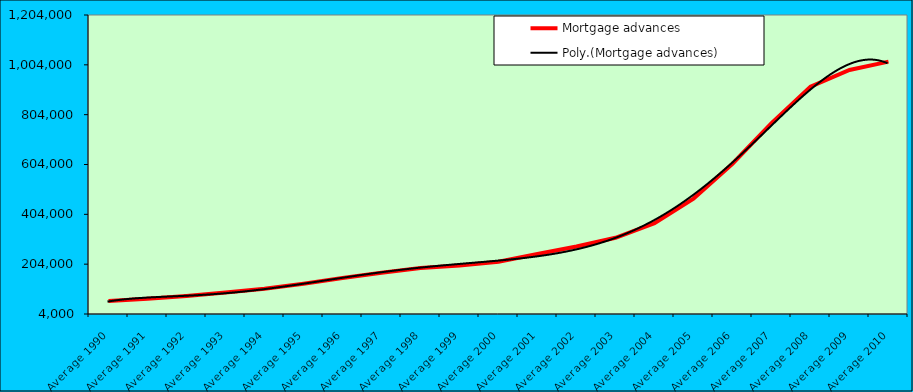
| Category | Mortgage advances |
|---|---|
| Average 1990 | 55774.333 |
| Average 1991 | 65278.083 |
| Average 1992 | 76558.167 |
| Average 1993 | 90123.417 |
| Average 1994 | 105359.333 |
| Average 1995 | 125662.167 |
| Average 1996 | 148595 |
| Average 1997 | 169484.833 |
| Average 1998 | 188294.75 |
| Average 1999 | 198923.818 |
| Average 2000 | 213769.583 |
| Average 2001 | 244476.636 |
| Average 2002 | 274873.333 |
| Average 2003 | 309819.333 |
| Average 2004 | 368591.917 |
| Average 2005 | 467276.583 |
| Average 2006 | 606976.583 |
| Average 2007 | 769995.917 |
| Average 2008 | 916337.333 |
| Average 2009 | 983455.583 |
| Average 2010 | 1016834 |